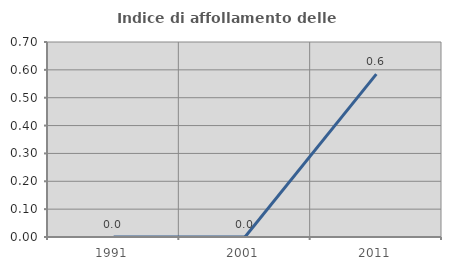
| Category | Indice di affollamento delle abitazioni  |
|---|---|
| 1991.0 | 0 |
| 2001.0 | 0 |
| 2011.0 | 0.585 |